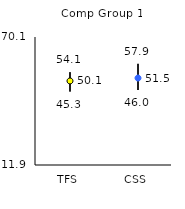
| Category | 25th | 75th | Mean |
|---|---|---|---|
| TFS | 45.3 | 54.1 | 50.11 |
| CSS | 46 | 57.9 | 51.45 |